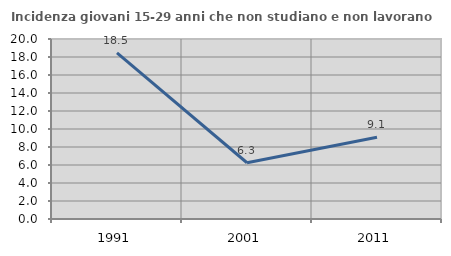
| Category | Incidenza giovani 15-29 anni che non studiano e non lavorano  |
|---|---|
| 1991.0 | 18.462 |
| 2001.0 | 6.25 |
| 2011.0 | 9.091 |